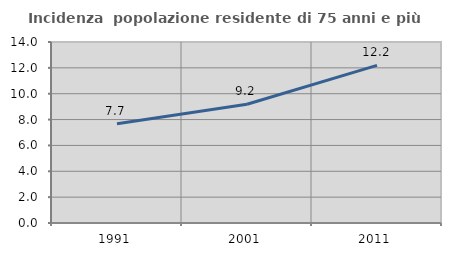
| Category | Incidenza  popolazione residente di 75 anni e più |
|---|---|
| 1991.0 | 7.673 |
| 2001.0 | 9.183 |
| 2011.0 | 12.19 |